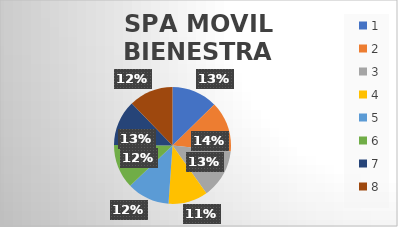
| Category | SPA MOVIL BIENESTRA SOÑADOR |
|---|---|
| 0 | 29 |
| 1 | 32 |
| 2 | 31 |
| 3 | 25 |
| 4 | 27 |
| 5 | 28 |
| 6 | 29 |
| 7 | 28 |